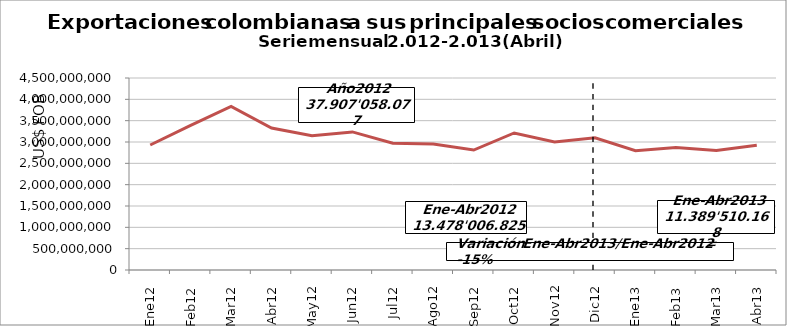
| Category | Series 0 |
|---|---|
| 0 | 2930154343 |
| 1 | 3388756727 |
| 2 | 3831741106 |
| 3 | 3327354649 |
| 4 | 3145484937 |
| 5 | 3236278458 |
| 6 | 2971258340 |
| 7 | 2953359855 |
| 8 | 2812086763 |
| 9 | 3212163932 |
| 10 | 2997958288 |
| 11 | 3100460679 |
| 12 | 2796638354.83 |
| 13 | 2869445760.18 |
| 14 | 2798440160.63 |
| 15 | 2924985892.44 |